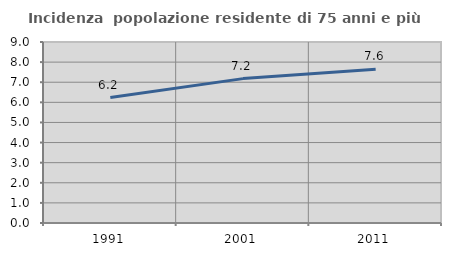
| Category | Incidenza  popolazione residente di 75 anni e più |
|---|---|
| 1991.0 | 6.238 |
| 2001.0 | 7.179 |
| 2011.0 | 7.646 |